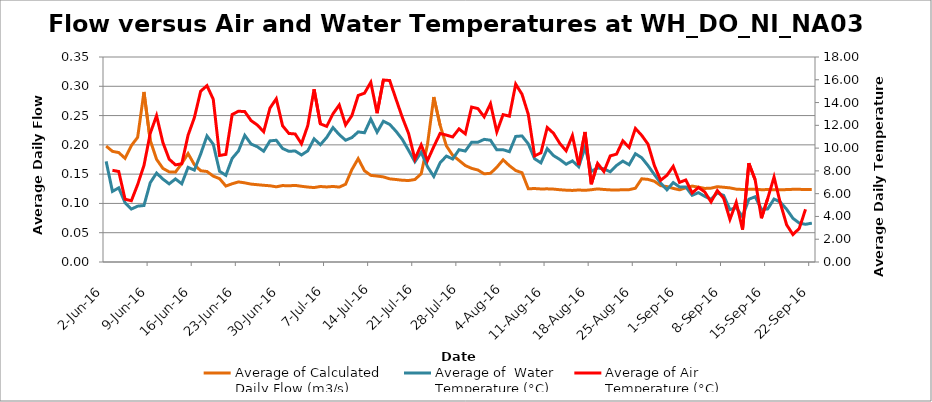
| Category | Average of Calculated 
Daily Flow (m3/s) |
|---|---|
| 2016-06-02 | 0.198 |
| 2016-06-03 | 0.189 |
| 2016-06-04 | 0.187 |
| 2016-06-05 | 0.177 |
| 2016-06-06 | 0.199 |
| 2016-06-07 | 0.213 |
| 2016-06-08 | 0.29 |
| 2016-06-09 | 0.208 |
| 2016-06-10 | 0.175 |
| 2016-06-11 | 0.16 |
| 2016-06-12 | 0.154 |
| 2016-06-13 | 0.153 |
| 2016-06-14 | 0.168 |
| 2016-06-15 | 0.185 |
| 2016-06-16 | 0.166 |
| 2016-06-17 | 0.156 |
| 2016-06-18 | 0.155 |
| 2016-06-19 | 0.147 |
| 2016-06-20 | 0.142 |
| 2016-06-21 | 0.13 |
| 2016-06-22 | 0.134 |
| 2016-06-23 | 0.137 |
| 2016-06-24 | 0.135 |
| 2016-06-25 | 0.133 |
| 2016-06-26 | 0.132 |
| 2016-06-27 | 0.131 |
| 2016-06-28 | 0.13 |
| 2016-06-29 | 0.128 |
| 2016-06-30 | 0.131 |
| 2016-07-01 | 0.13 |
| 2016-07-02 | 0.131 |
| 2016-07-03 | 0.129 |
| 2016-07-04 | 0.128 |
| 2016-07-05 | 0.127 |
| 2016-07-06 | 0.129 |
| 2016-07-07 | 0.128 |
| 2016-07-08 | 0.129 |
| 2016-07-09 | 0.128 |
| 2016-07-10 | 0.133 |
| 2016-07-11 | 0.158 |
| 2016-07-12 | 0.176 |
| 2016-07-13 | 0.156 |
| 2016-07-14 | 0.148 |
| 2016-07-15 | 0.147 |
| 2016-07-16 | 0.145 |
| 2016-07-17 | 0.142 |
| 2016-07-18 | 0.141 |
| 2016-07-19 | 0.14 |
| 2016-07-20 | 0.139 |
| 2016-07-21 | 0.141 |
| 2016-07-22 | 0.151 |
| 2016-07-23 | 0.201 |
| 2016-07-24 | 0.282 |
| 2016-07-25 | 0.234 |
| 2016-07-26 | 0.198 |
| 2016-07-27 | 0.182 |
| 2016-07-28 | 0.173 |
| 2016-07-29 | 0.165 |
| 2016-07-30 | 0.16 |
| 2016-07-31 | 0.157 |
| 2016-08-01 | 0.151 |
| 2016-08-02 | 0.151 |
| 2016-08-03 | 0.162 |
| 2016-08-04 | 0.174 |
| 2016-08-05 | 0.164 |
| 2016-08-06 | 0.156 |
| 2016-08-07 | 0.152 |
| 2016-08-08 | 0.125 |
| 2016-08-09 | 0.125 |
| 2016-08-10 | 0.125 |
| 2016-08-11 | 0.125 |
| 2016-08-12 | 0.124 |
| 2016-08-13 | 0.123 |
| 2016-08-14 | 0.123 |
| 2016-08-15 | 0.122 |
| 2016-08-16 | 0.123 |
| 2016-08-17 | 0.122 |
| 2016-08-18 | 0.123 |
| 2016-08-19 | 0.125 |
| 2016-08-20 | 0.124 |
| 2016-08-21 | 0.123 |
| 2016-08-22 | 0.123 |
| 2016-08-23 | 0.124 |
| 2016-08-24 | 0.123 |
| 2016-08-25 | 0.126 |
| 2016-08-26 | 0.142 |
| 2016-08-27 | 0.141 |
| 2016-08-28 | 0.138 |
| 2016-08-29 | 0.13 |
| 2016-08-30 | 0.129 |
| 2016-08-31 | 0.126 |
| 2016-09-01 | 0.123 |
| 2016-09-02 | 0.127 |
| 2016-09-03 | 0.13 |
| 2016-09-04 | 0.128 |
| 2016-09-05 | 0.126 |
| 2016-09-06 | 0.126 |
| 2016-09-07 | 0.129 |
| 2016-09-08 | 0.128 |
| 2016-09-09 | 0.127 |
| 2016-09-10 | 0.124 |
| 2016-09-11 | 0.124 |
| 2016-09-12 | 0.124 |
| 2016-09-13 | 0.124 |
| 2016-09-14 | 0.123 |
| 2016-09-15 | 0.124 |
| 2016-09-16 | 0.123 |
| 2016-09-17 | 0.123 |
| 2016-09-18 | 0.124 |
| 2016-09-19 | 0.124 |
| 2016-09-20 | 0.124 |
| 2016-09-21 | 0.124 |
| 2016-09-22 | 0.124 |